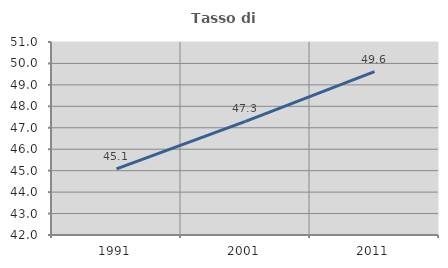
| Category | Tasso di occupazione   |
|---|---|
| 1991.0 | 45.086 |
| 2001.0 | 47.296 |
| 2011.0 | 49.621 |